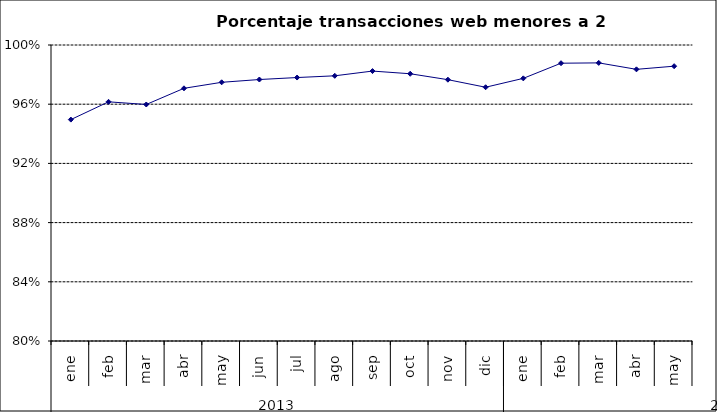
| Category | 94,96% 96,16% 95,98% 97,07% 97,48% 97,67% 97,80% 97,92% 98,24% 98,06% 97,66% 97,15% 97,75% 98,77% 98,79% 98,36% 98,57% |
|---|---|
| 0 | 0.95 |
| 1 | 0.962 |
| 2 | 0.96 |
| 3 | 0.971 |
| 4 | 0.975 |
| 5 | 0.977 |
| 6 | 0.978 |
| 7 | 0.979 |
| 8 | 0.982 |
| 9 | 0.981 |
| 10 | 0.977 |
| 11 | 0.971 |
| 12 | 0.977 |
| 13 | 0.988 |
| 14 | 0.988 |
| 15 | 0.984 |
| 16 | 0.986 |